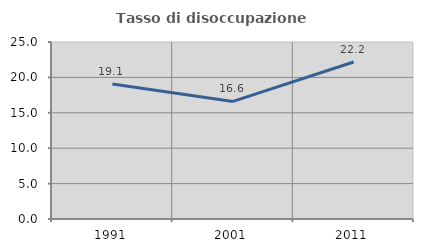
| Category | Tasso di disoccupazione giovanile  |
|---|---|
| 1991.0 | 19.055 |
| 2001.0 | 16.61 |
| 2011.0 | 22.179 |